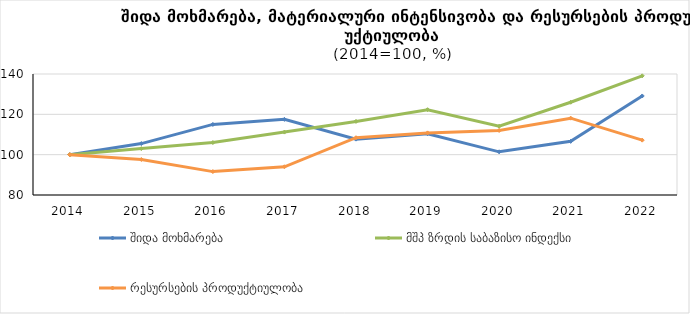
| Category | შიდა მოხმარება | მშპ ზრდის საბაზისო ინდექსი | რესურსების პროდუქტიულობა |
|---|---|---|---|
| 2014.0 | 100 | 100 | 100 |
| 2015.0 | 105.5 | 103 | 97.6 |
| 2016.0 | 115 | 106 | 91.6 |
| 2017.0 | 117.5 | 111.2 | 94 |
| 2018.0 | 107.7 | 116.5 | 108.4 |
| 2019.0 | 110.4 | 122.3 | 110.8 |
| 2020.0 | 101.4 | 114.1 | 112 |
| 2021.0 | 106.6 | 126 | 118.1 |
| 2022.0 | 129.1 | 139.1 | 107.2 |